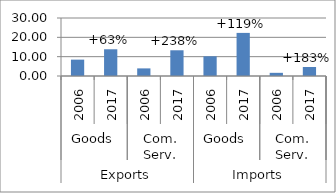
| Category | Trade flows |
|---|---|
| 0 | 8.465 |
| 1 | 13.822 |
| 2 | 3.936 |
| 3 | 13.303 |
| 4 | 10.189 |
| 5 | 22.293 |
| 6 | 1.641 |
| 7 | 4.652 |